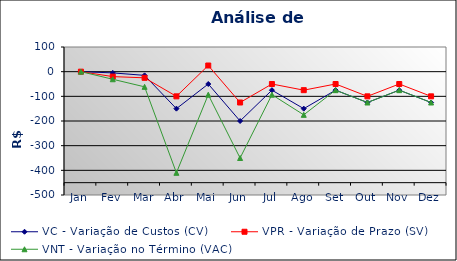
| Category | VC - Variação de Custos (CV) | VPR - Variação de Prazo (SV) | VNT - Variação no Término (VAC) |
|---|---|---|---|
| Jan | 0 | 0 | 0 |
| Fev | -5 | -20 | -30.75 |
| Mar | -15 | -25 | -61.5 |
| Abr | -150 | -100 | -410 |
| Mai | -50 | 25 | -93.333 |
| Jun | -200 | -125 | -350 |
| Jul | -75 | -50 | -93.333 |
| Ago | -150 | -75 | -175 |
| Set | -75 | -50 | -75 |
| Out | -125 | -100 | -125 |
| Nov | -75 | -50 | -75 |
| Dez | -125 | -100 | -125 |